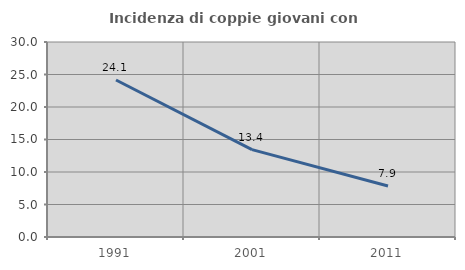
| Category | Incidenza di coppie giovani con figli |
|---|---|
| 1991.0 | 24.15 |
| 2001.0 | 13.447 |
| 2011.0 | 7.855 |